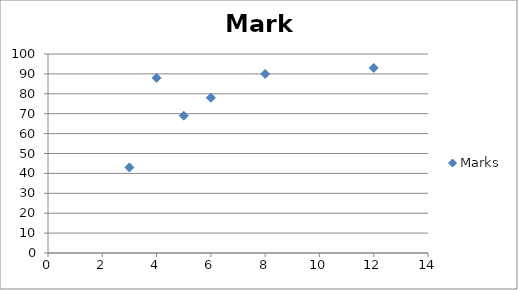
| Category | Marks |
|---|---|
| 6.0 | 78 |
| 4.0 | 88 |
| 3.0 | 43 |
| 5.0 | 69 |
| 8.0 | 90 |
| 12.0 | 93 |